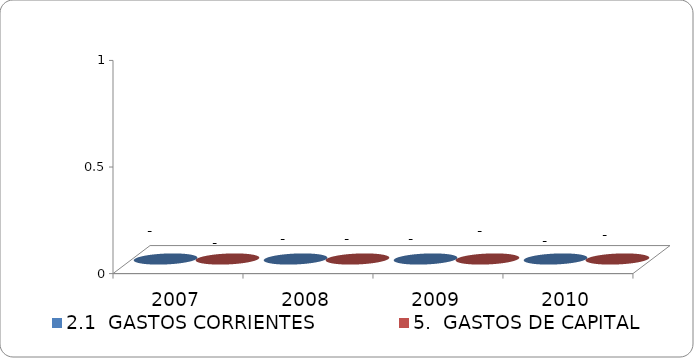
| Category | 2.1  GASTOS CORRIENTES | 5.  GASTOS DE CAPITAL |
|---|---|---|
| 2007 | 0 | 0 |
| 2008 | 0 | 0 |
| 2009 | 0 | 0 |
| 2010 | 0 | 0 |